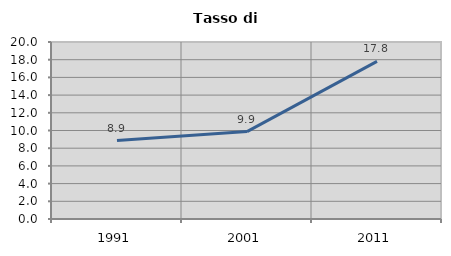
| Category | Tasso di disoccupazione   |
|---|---|
| 1991.0 | 8.861 |
| 2001.0 | 9.877 |
| 2011.0 | 17.808 |